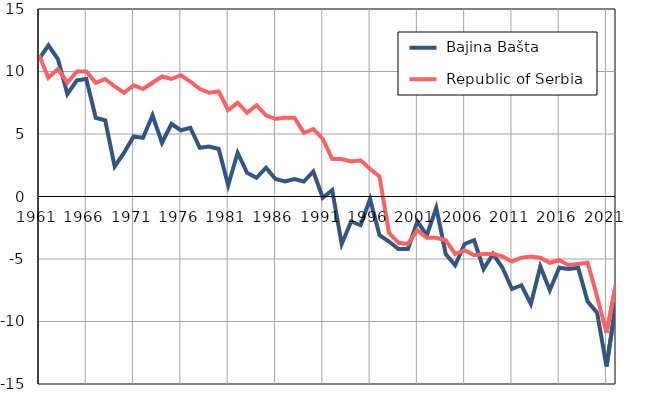
| Category |  Bajina Bašta |  Republic of Serbia |
|---|---|---|
| 1961.0 | 11 | 11.3 |
| 1962.0 | 12.1 | 9.5 |
| 1963.0 | 11 | 10.2 |
| 1964.0 | 8.2 | 9.1 |
| 1965.0 | 9.3 | 10 |
| 1966.0 | 9.4 | 10 |
| 1967.0 | 6.3 | 9.1 |
| 1968.0 | 6.1 | 9.4 |
| 1969.0 | 2.4 | 8.8 |
| 1970.0 | 3.5 | 8.3 |
| 1971.0 | 4.8 | 8.9 |
| 1972.0 | 4.7 | 8.6 |
| 1973.0 | 6.5 | 9.1 |
| 1974.0 | 4.3 | 9.6 |
| 1975.0 | 5.8 | 9.4 |
| 1976.0 | 5.3 | 9.7 |
| 1977.0 | 5.5 | 9.2 |
| 1978.0 | 3.9 | 8.6 |
| 1979.0 | 4 | 8.3 |
| 1980.0 | 3.8 | 8.4 |
| 1981.0 | 0.9 | 6.9 |
| 1982.0 | 3.5 | 7.5 |
| 1983.0 | 1.9 | 6.7 |
| 1984.0 | 1.5 | 7.3 |
| 1985.0 | 2.3 | 6.5 |
| 1986.0 | 1.4 | 6.2 |
| 1987.0 | 1.2 | 6.3 |
| 1988.0 | 1.4 | 6.3 |
| 1989.0 | 1.2 | 5.1 |
| 1990.0 | 2 | 5.4 |
| 1991.0 | -0.1 | 4.6 |
| 1992.0 | 0.5 | 3 |
| 1993.0 | -3.8 | 3 |
| 1994.0 | -2 | 2.8 |
| 1995.0 | -2.3 | 2.9 |
| 1996.0 | -0.2 | 2.2 |
| 1997.0 | -3.1 | 1.6 |
| 1998.0 | -3.6 | -2.9 |
| 1999.0 | -4.2 | -3.7 |
| 2000.0 | -4.2 | -3.8 |
| 2001.0 | -2 | -2.7 |
| 2002.0 | -3.1 | -3.3 |
| 2003.0 | -0.9 | -3.3 |
| 2004.0 | -4.6 | -3.5 |
| 2005.0 | -5.5 | -4.6 |
| 2006.0 | -3.8 | -4.3 |
| 2007.0 | -3.5 | -4.7 |
| 2008.0 | -5.8 | -4.6 |
| 2009.0 | -4.6 | -4.6 |
| 2010.0 | -5.7 | -4.8 |
| 2011.0 | -7.4 | -5.2 |
| 2012.0 | -7.1 | -4.9 |
| 2013.0 | -8.6 | -4.8 |
| 2014.0 | -5.6 | -4.9 |
| 2015.0 | -7.5 | -5.3 |
| 2016.0 | -5.7 | -5.1 |
| 2017.0 | -5.8 | -5.5 |
| 2018.0 | -5.7 | -5.4 |
| 2019.0 | -8.4 | -5.3 |
| 2020.0 | -9.3 | -8 |
| 2021.0 | -13.6 | -10.9 |
| 2022.0 | -8.5 | -7 |